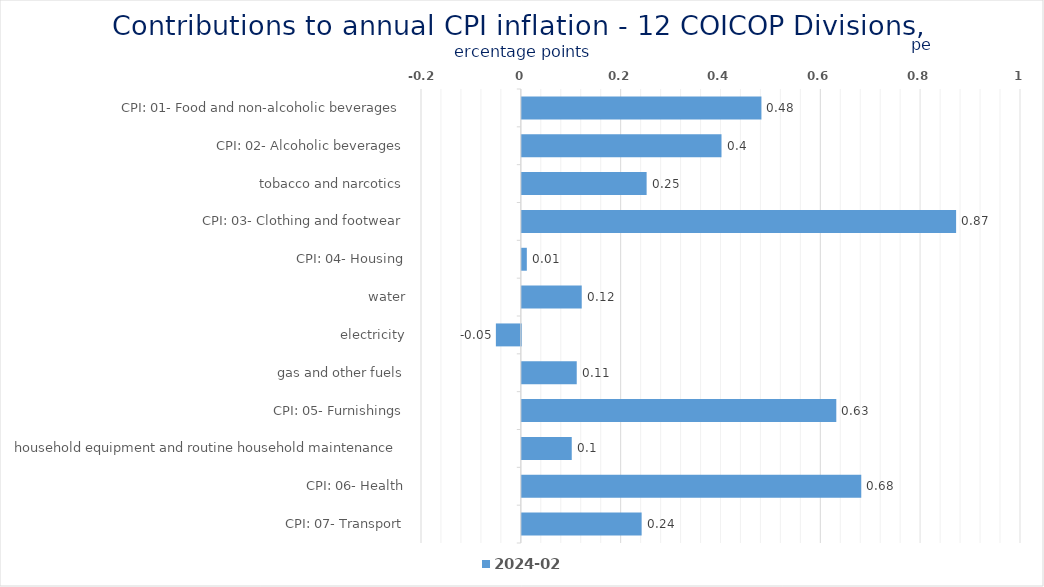
| Category | 2024-02 |
|---|---|
| CPI: 01- Food and non-alcoholic beverages | 0.48 |
| CPI: 02- Alcoholic beverages, tobacco and narcotics | 0.4 |
| CPI: 03- Clothing and footwear | 0.25 |
| CPI: 04- Housing, water, electricity, gas and other fuels | 0.87 |
| CPI: 05- Furnishings, household equipment and routine household maintenance | 0.01 |
| CPI: 06- Health | 0.12 |
| CPI: 07- Transport | -0.05 |
| CPI: 08- Communication | 0.11 |
| CPI: 09- Recreation and culture | 0.63 |
| CPI: 10- Education | 0.1 |
| CPI: 11- Restaurants and hotels | 0.68 |
| CPI: 12- Miscellaneous goods and services | 0.24 |